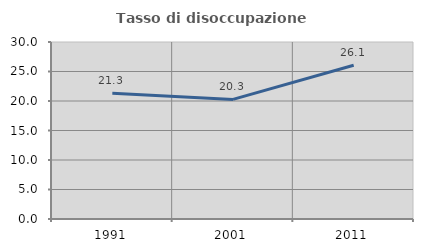
| Category | Tasso di disoccupazione giovanile  |
|---|---|
| 1991.0 | 21.295 |
| 2001.0 | 20.273 |
| 2011.0 | 26.061 |